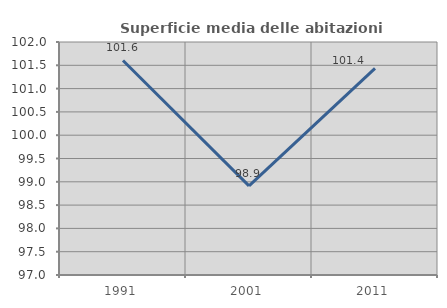
| Category | Superficie media delle abitazioni occupate |
|---|---|
| 1991.0 | 101.603 |
| 2001.0 | 98.912 |
| 2011.0 | 101.435 |